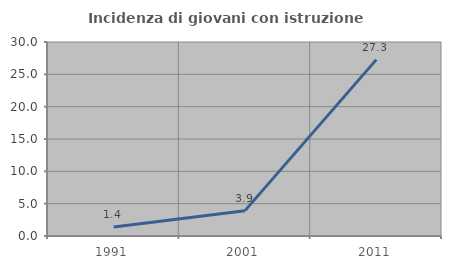
| Category | Incidenza di giovani con istruzione universitaria |
|---|---|
| 1991.0 | 1.408 |
| 2001.0 | 3.922 |
| 2011.0 | 27.273 |